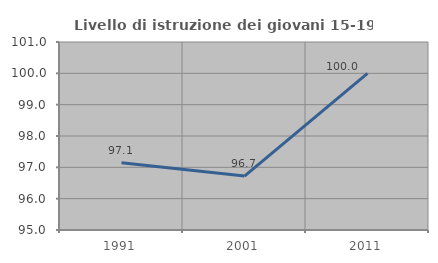
| Category | Livello di istruzione dei giovani 15-19 anni |
|---|---|
| 1991.0 | 97.143 |
| 2001.0 | 96.721 |
| 2011.0 | 100 |